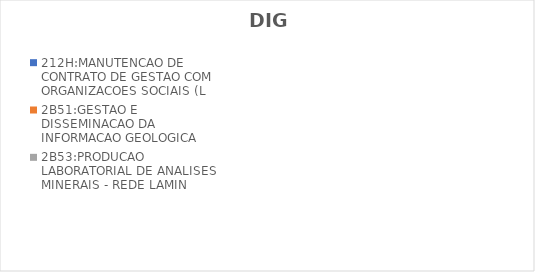
| Category | 212H:MANUTENCAO DE CONTRATO DE GESTAO COM ORGANIZACOES SOCIAIS (L | 2B51:GESTAO E DISSEMINACAO DA INFORMACAO GEOLOGICA | 2B53:PRODUCAO LABORATORIAL DE ANALISES MINERAIS - REDE LAMIN |
|---|---|---|---|
| EXECUTADO | 0 | 0.729 | 0.35 |